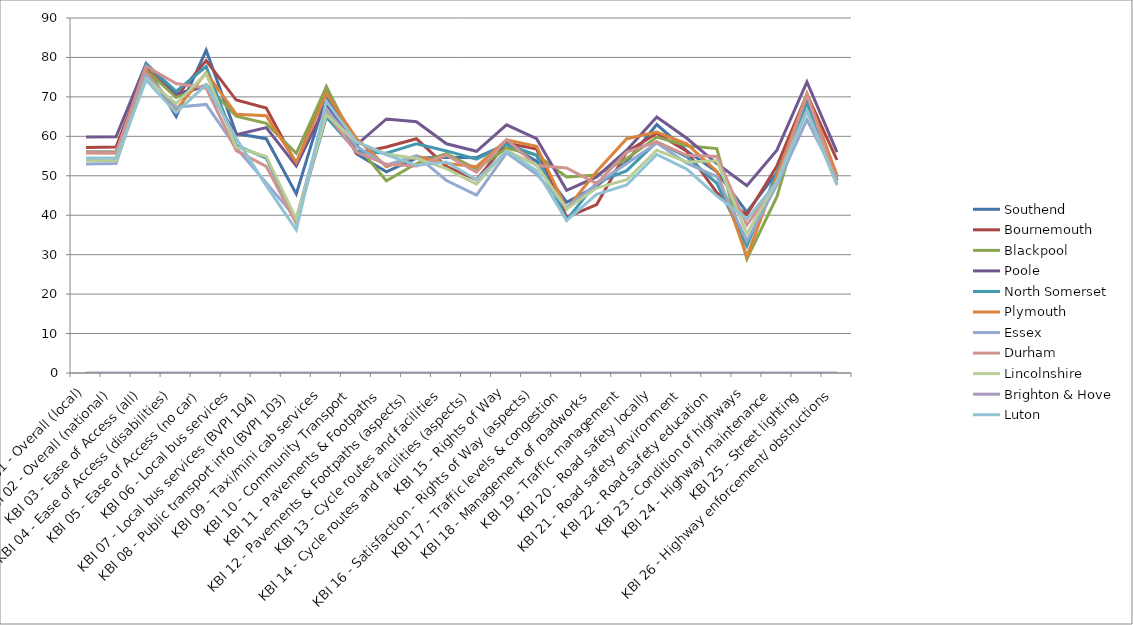
| Category | Southend | Bournemouth | Blackpool | Poole | North Somerset | Plymouth | Essex | Durham | Lincolnshire | Brighton & Hove | Luton |
|---|---|---|---|---|---|---|---|---|---|---|---|
| KBI 01 - Overall (local) | 56 | 57.2 | 56 | 59.8 | 53.9 | 55.8 | 53 | 55.9 | 53.9 | 0 | 54.5 |
| KBI 02 - Overall (national) | 56 | 57.3 | 55.9 | 59.9 | 54 | 55.8 | 53.1 | 55.8 | 53.9 | 0 | 54.5 |
| KBI 03 - Ease of Access (all) | 77.7 | 77.2 | 76.8 | 78.5 | 78.4 | 76.5 | 75.7 | 77.8 | 74.6 | 0 | 74.3 |
| KBI 04 - Ease of Access (disabilities) | 65 | 70 | 69.9 | 70.8 | 71.4 | 66.7 | 67.4 | 73.4 | 68.3 | 0 | 66 |
| KBI 05 - Ease of Access (no car) | 81.8 | 79.2 | 73.1 | 72.7 | 77.7 | 76.1 | 68.1 | 72.2 | 75.9 | 0 | 73.1 |
| KBI 06 - Local bus services | 60.7 | 69.2 | 65.1 | 60.4 | 57.7 | 65.6 | 57.1 | 56.4 | 57.3 | 0 | 59.5 |
| KBI 07 - Local bus services (BVPI 104) | 59.4 | 67.2 | 63.3 | 62.2 | 54.5 | 65.2 | 48.2 | 52.4 | 54.9 | 0 | 47.5 |
| KBI 08 - Public transport info (BVPI 103) | 45.4 | 53 | 55.7 | 52.5 | 38.5 | 53.4 | 39.2 | 37.9 | 39 | 0 | 36.3 |
| KBI 09 - Taxi/mini cab services | 70.4 | 72.5 | 72.5 | 68.2 | 64.9 | 70.8 | 66.9 | 65.9 | 65.5 | 0 | 68.9 |
| KBI 10 - Community Transport | 55.6 | 55.7 | 57.9 | 57.8 | 56.3 | 59.5 | 57.5 | 56 | 58.6 | 0 | 58.6 |
| KBI 11 - Pavements & Footpaths | 51 | 57.3 | 48.7 | 64.4 | 55.7 | 52.3 | 52.7 | 52.9 | 55.5 | 0 | 55.3 |
| KBI 12 - Pavements & Footpaths (aspects) | 54.5 | 59.4 | 53.1 | 63.7 | 58.1 | 55 | 55.1 | 52.5 | 54.4 | 0 | 52.7 |
| KBI 13 - Cycle routes and facilities | 54.7 | 52.3 | 55.6 | 58.1 | 56.3 | 53.1 | 48.8 | 55.2 | 51.8 | 0 | 53.5 |
| KBI 14 - Cycle routes and facilities (aspects) | 54.6 | 49 | 51.7 | 56.2 | 54.2 | 52.3 | 45.1 | 50.9 | 47.9 | 0 | 49 |
| KBI 15 - Rights of Way | 58 | 58.3 | 57 | 62.9 | 58 | 59.1 | 55.8 | 59.2 | 56.4 | 0 | 56.2 |
| KBI 16 - Satisfaction - Rights of Way (aspects) | 53.7 | 56.8 | 55.3 | 59.4 | 55.2 | 57.5 | 50.4 | 52.6 | 52.7 | 0 | 51.3 |
| KBI 17 - Traffic levels & congestion | 43.3 | 39.5 | 49.7 | 46.3 | 38.8 | 41.6 | 42 | 52 | 41.6 | 0 | 38.7 |
| KBI 18 - Management of roadworks | 47.4 | 42.7 | 50.2 | 49.7 | 48.3 | 51.1 | 47.9 | 48 | 46.9 | 0 | 45.3 |
| KBI 19 - Traffic management | 53.6 | 56 | 54.3 | 56.5 | 51.3 | 59.4 | 53.1 | 56 | 49 | 0 | 47.7 |
| KBI 20 - Road safety locally | 63 | 60.8 | 59.8 | 64.9 | 58.6 | 61.1 | 58.3 | 58.6 | 56.5 | 0 | 55.4 |
| KBI 21 - Road safety environment | 56.3 | 56.2 | 57.6 | 59.5 | 54.8 | 58.1 | 53.2 | 55.2 | 53.5 | 0 | 51.7 |
| KBI 22 - Road safety education | 51 | 45.7 | 56.9 | 53.1 | 48.1 | 51.1 | 49.8 | 54.9 | 53.8 | 0 | 44.9 |
| KBI 23 - Condition of highways | 40.8 | 40.1 | 28.9 | 47.5 | 32.2 | 29.5 | 33.5 | 37.5 | 35.3 | 0 | 39 |
| KBI 24 - Highway maintenance | 50.8 | 52.5 | 44.7 | 56.5 | 50.8 | 50 | 47.7 | 48.3 | 48.6 | 0 | 48.4 |
| KBI 25 - Street lighting | 69.1 | 70.7 | 70.5 | 73.8 | 68.1 | 70.8 | 64.2 | 70.6 | 66.5 | 0 | 66.5 |
| KBI 26 - Highway enforcement/ obstructions | 49 | 54 | 49.5 | 56 | 48.8 | 50.1 | 49.2 | 47.9 | 47.6 | 0 | 47.8 |